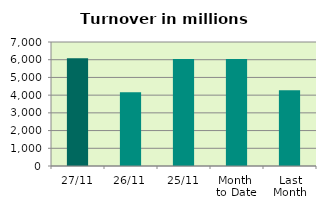
| Category | Series 0 |
|---|---|
| 27/11 | 6077.744 |
| 26/11 | 4159.351 |
| 25/11 | 6038.239 |
| Month 
to Date | 6040.261 |
| Last
Month | 4277.774 |